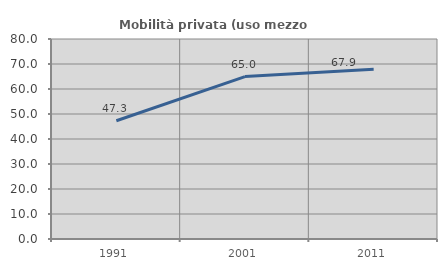
| Category | Mobilità privata (uso mezzo privato) |
|---|---|
| 1991.0 | 47.315 |
| 2001.0 | 64.976 |
| 2011.0 | 67.857 |